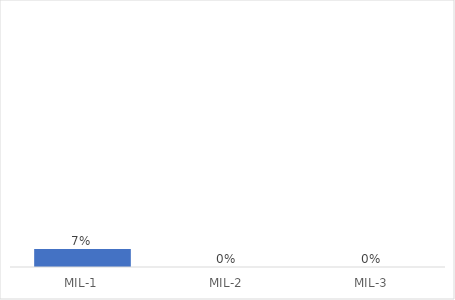
| Category | Complete % |
|---|---|
| MIL-1 | 0.07 |
| MIL-2 | 0 |
| MIL-3 | 0 |